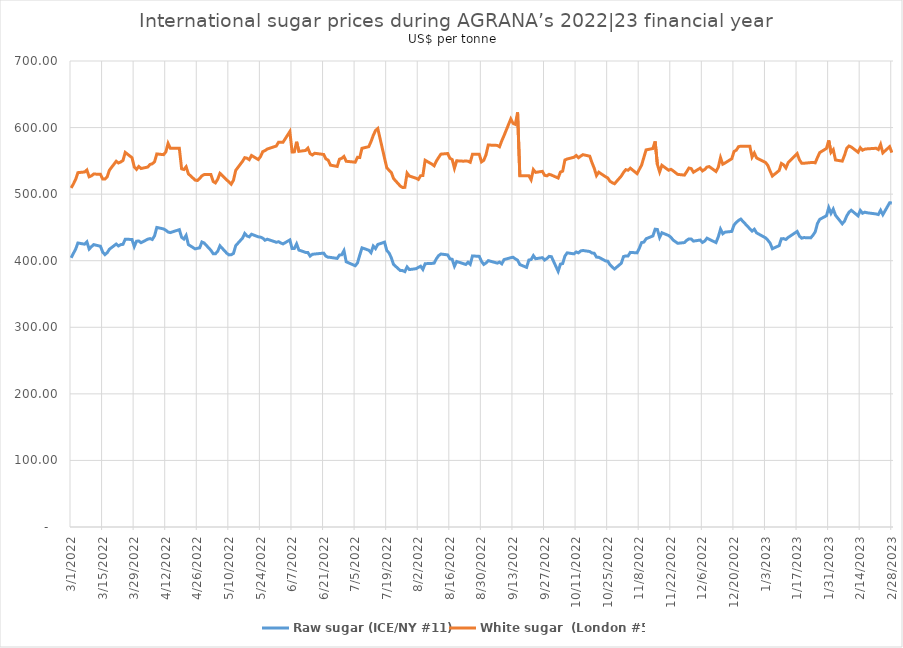
| Category | Raw sugar (ICE/NY #11) | White sugar  (London #5) |
|---|---|---|
| 3/1/22 | 404.328 | 509.3 |
| 3/2/22 | 410.942 | 515.2 |
| 3/3/22 | 417.335 | 522.2 |
| 3/4/22 | 426.595 | 532.3 |
| 3/7/22 | 424.831 | 533.3 |
| 3/8/22 | 428.358 | 536.3 |
| 3/9/22 | 417.556 | 526.1 |
| 3/10/22 | 421.083 | 527.5 |
| 3/11/22 | 424.17 | 530.2 |
| 3/14/22 | 421.745 | 529.8 |
| 3/15/22 | 412.926 | 522.7 |
| 3/16/22 | 409.178 | 522.6 |
| 3/17/22 | 412.044 | 526 |
| 3/18/22 | 417.335 | 536.1 |
| 3/21/22 | 425.052 | 549.4 |
| 3/22/22 | 422.186 | 546.8 |
| 3/23/22 | 424.17 | 548.4 |
| 3/24/22 | 424.611 | 550.6 |
| 3/25/22 | 432.327 | 562.7 |
| 3/28/22 | 431.886 | 554.8 |
| 3/29/22 | 421.304 | 540.8 |
| 3/30/22 | 429.24 | 537.2 |
| 3/31/22 | 429.681 | 541.5 |
| 4/1/22 | 427.036 | 538.5 |
| 4/4/22 | 432.327 | 540.7 |
| 4/5/22 | 433.209 | 544.6 |
| 4/6/22 | 431.886 | 545.6 |
| 4/7/22 | 437.397 | 548.7 |
| 4/8/22 | 449.964 | 560.4 |
| 4/11/22 | 447.759 | 559.3 |
| 4/12/22 | 445.775 | 563.4 |
| 4/13/22 | 443.129 | 576.2 |
| 4/14/22 | 442.248 | 568.8 |
| 4/18/22 | 446.657 | 568.8 |
| 4/19/22 | 435.193 | 538 |
| 4/20/22 | 432.547 | 537 |
| 4/21/22 | 438.059 | 541.1 |
| 4/22/22 | 424.17 | 530.5 |
| 4/25/22 | 417.776 | 521.1 |
| 4/26/22 | 418.658 | 520.5 |
| 4/27/22 | 419.319 | 523.5 |
| 4/28/22 | 428.138 | 527.5 |
| 4/29/22 | 426.595 | 529.4 |
| 5/2/22 | 415.572 | 529.4 |
| 5/3/22 | 410.501 | 519 |
| 5/4/22 | 410.501 | 516.9 |
| 5/5/22 | 414.028 | 522.3 |
| 5/6/22 | 422.406 | 531.3 |
| 5/9/22 | 411.383 | 521.4 |
| 5/10/22 | 408.737 | 518.3 |
| 5/11/22 | 408.958 | 515 |
| 5/12/22 | 410.942 | 520.9 |
| 5/13/22 | 422.626 | 535.7 |
| 5/16/22 | 433.87 | 549.2 |
| 5/17/22 | 440.925 | 554.8 |
| 5/18/22 | 437.177 | 554 |
| 5/19/22 | 435.854 | 551.8 |
| 5/20/22 | 439.822 | 558.1 |
| 5/23/22 | 435.854 | 552 |
| 5/24/22 | 435.413 | 556.5 |
| 5/25/22 | 433.87 | 563.9 |
| 5/26/22 | 430.784 | 565.4 |
| 5/27/22 | 432.327 | 567.8 |
| 5/31/22 | 427.697 | 572.3 |
| 6/1/22 | 428.579 | 578.1 |
| 6/2/22 | 426.595 | 578.1 |
| 6/3/22 | 425.272 | 578.1 |
| 6/6/22 | 431.224 | 594 |
| 6/7/22 | 418.217 | 563.4 |
| 6/8/22 | 418.438 | 563.5 |
| 6/9/22 | 425.272 | 578.7 |
| 6/10/22 | 416.013 | 564.3 |
| 6/13/22 | 412.485 | 565.6 |
| 6/14/22 | 412.265 | 569.1 |
| 6/15/22 | 406.974 | 560.8 |
| 6/16/22 | 409.619 | 558.8 |
| 6/17/22 | 410.06 | 561.4 |
| 6/21/22 | 411.383 | 559.6 |
| 6/22/22 | 406.753 | 553 |
| 6/23/22 | 405.21 | 551 |
| 6/24/22 | 404.989 | 543.6 |
| 6/27/22 | 403.446 | 541.6 |
| 6/28/22 | 408.517 | 552.5 |
| 6/29/22 | 408.958 | 553.8 |
| 6/30/22 | 415.131 | 556.6 |
| 7/1/22 | 398.376 | 549.4 |
| 7/5/22 | 392.423 | 548 |
| 7/6/22 | 396.612 | 555.3 |
| 7/7/22 | 408.296 | 555 |
| 7/8/22 | 419.319 | 568.9 |
| 7/11/22 | 415.792 | 571.3 |
| 7/12/22 | 412.044 | 578.9 |
| 7/13/22 | 421.965 | 588.2 |
| 7/14/22 | 418.217 | 595.6 |
| 7/15/22 | 424.39 | 598.6 |
| 7/18/22 | 427.918 | 554.1 |
| 7/19/22 | 415.351 | 539.6 |
| 7/20/22 | 411.603 | 535.9 |
| 7/21/22 | 404.549 | 532.6 |
| 7/22/22 | 394.407 | 523.4 |
| 7/25/22 | 385.148 | 512.1 |
| 7/26/22 | 385.148 | 510 |
| 7/27/22 | 383.605 | 510.2 |
| 7/28/22 | 390.659 | 531.6 |
| 7/29/22 | 386.691 | 527.2 |
| 8/1/22 | 388.014 | 523.9 |
| 8/2/22 | 389.998 | 522.1 |
| 8/3/22 | 391.762 | 527.7 |
| 8/4/22 | 386.912 | 528 |
| 8/5/22 | 395.51 | 550.9 |
| 8/8/22 | 395.95 | 545.1 |
| 8/9/22 | 396.391 | 542.6 |
| 8/10/22 | 403.005 | 549.7 |
| 8/11/22 | 407.635 | 555.1 |
| 8/12/22 | 410.06 | 560.1 |
| 8/15/22 | 408.737 | 561 |
| 8/16/22 | 402.785 | 553.9 |
| 8/17/22 | 402.123 | 552 |
| 8/18/22 | 391.762 | 538.9 |
| 8/19/22 | 398.816 | 550.1 |
| 8/22/22 | 395.51 | 549.5 |
| 8/23/22 | 394.407 | 549.8 |
| 8/24/22 | 397.714 | 549.5 |
| 8/25/22 | 394.628 | 547.9 |
| 8/26/22 | 407.194 | 559.9 |
| 8/29/22 | 406.533 | 559.9 |
| 8/30/22 | 399.037 | 548.5 |
| 8/31/22 | 394.407 | 550.8 |
| 9/1/22 | 396.612 | 559.1 |
| 9/2/22 | 400.139 | 573.8 |
| 9/6/22 | 396.391 | 573.2 |
| 9/7/22 | 397.935 | 571.2 |
| 9/8/22 | 395.289 | 580.2 |
| 9/9/22 | 401.682 | 588 |
| 9/12/22 | 404.549 | 613 |
| 9/13/22 | 405.21 | 606.3 |
| 9/14/22 | 402.785 | 604.8 |
| 9/15/22 | 400.801 | 622.8 |
| 9/16/22 | 394.187 | 527.8 |
| 9/19/22 | 389.998 | 527.8 |
| 9/20/22 | 401.021 | 527.7 |
| 9/21/22 | 401.682 | 521.6 |
| 9/22/22 | 407.635 | 536.9 |
| 9/23/22 | 403.005 | 532.7 |
| 9/26/22 | 404.549 | 534.2 |
| 9/27/22 | 401.021 | 528.3 |
| 9/28/22 | 403.226 | 527.5 |
| 9/29/22 | 406.533 | 529.8 |
| 9/30/22 | 406.092 | 528.7 |
| 10/3/22 | 384.046 | 524.2 |
| 10/4/22 | 394.848 | 533.1 |
| 10/5/22 | 395.73 | 534.6 |
| 10/6/22 | 406.974 | 551.3 |
| 10/7/22 | 411.824 | 552.8 |
| 10/10/22 | 410.281 | 555.4 |
| 10/11/22 | 413.147 | 558 |
| 10/12/22 | 411.824 | 554.6 |
| 10/13/22 | 414.69 | 557.2 |
| 10/14/22 | 415.351 | 559.3 |
| 10/17/22 | 413.808 | 557 |
| 10/18/22 | 411.603 | 547.3 |
| 10/19/22 | 411.162 | 538.8 |
| 10/20/22 | 405.43 | 527.9 |
| 10/21/22 | 405.21 | 533 |
| 10/24/22 | 399.698 | 526.2 |
| 10/25/22 | 399.257 | 524.3 |
| 10/26/22 | 393.746 | 519.3 |
| 10/27/22 | 390.439 | 517.2 |
| 10/28/22 | 387.573 | 515.6 |
| 10/31/22 | 396.171 | 527.2 |
| 11/1/22 | 406.312 | 532.7 |
| 11/2/22 | 407.194 | 536.8 |
| 11/3/22 | 407.194 | 535.9 |
| 11/4/22 | 412.485 | 539 |
| 11/7/22 | 411.824 | 530.8 |
| 11/8/22 | 418.879 | 537.3 |
| 11/9/22 | 427.256 | 543.5 |
| 11/10/22 | 427.918 | 555.1 |
| 11/11/22 | 432.988 | 566.5 |
| 11/14/22 | 437.177 | 568.5 |
| 11/15/22 | 447.318 | 579.2 |
| 11/16/22 | 446.877 | 544.6 |
| 11/17/22 | 434.972 | 533.4 |
| 11/18/22 | 442.027 | 543.3 |
| 11/21/22 | 437.838 | 535.9 |
| 11/22/22 | 435.193 | 537.3 |
| 11/23/22 | 431.004 | 535 |
| 11/25/22 | 426.154 | 529.7 |
| 11/28/22 | 427.256 | 528.6 |
| 11/29/22 | 430.563 | 533.7 |
| 11/30/22 | 432.768 | 539.2 |
| 12/1/22 | 432.547 | 538.4 |
| 12/2/22 | 429.461 | 532.9 |
| 12/5/22 | 431.004 | 539.1 |
| 12/6/22 | 427.477 | 534.9 |
| 12/7/22 | 429.461 | 537.1 |
| 12/8/22 | 433.87 | 540.6 |
| 12/9/22 | 432.106 | 541.4 |
| 12/12/22 | 427.256 | 534 |
| 12/13/22 | 435.634 | 540.3 |
| 12/14/22 | 447.318 | 554.8 |
| 12/15/22 | 440.484 | 545 |
| 12/16/22 | 442.909 | 546.8 |
| 12/19/22 | 444.011 | 553.2 |
| 12/20/22 | 453.712 | 564.1 |
| 12/21/22 | 457.459 | 566.1 |
| 12/22/22 | 460.546 | 571.3 |
| 12/23/22 | 462.53 | 572.1 |
| 12/27/22 | 447.98 | 572.1 |
| 12/28/22 | 444.452 | 555.7 |
| 12/29/22 | 447.318 | 561.8 |
| 12/30/22 | 441.807 | 554.4 |
| 1/3/23 | 434.311 | 547.5 |
| 1/4/23 | 430.784 | 543.1 |
| 1/5/23 | 426.374 | 534.7 |
| 1/6/23 | 417.997 | 527.2 |
| 1/9/23 | 422.626 | 535.5 |
| 1/10/23 | 432.988 | 546.1 |
| 1/11/23 | 433.209 | 544 |
| 1/12/23 | 431.886 | 539.3 |
| 1/13/23 | 434.972 | 547.3 |
| 1/17/23 | 444.011 | 560.9 |
| 1/18/23 | 436.956 | 551.6 |
| 1/19/23 | 433.87 | 546.5 |
| 1/20/23 | 434.752 | 546.4 |
| 1/23/23 | 434.311 | 547.4 |
| 1/24/23 | 438.279 | 547.7 |
| 1/25/23 | 443.35 | 547 |
| 1/26/23 | 455.916 | 555 |
| 1/27/23 | 462.089 | 562.4 |
| 1/30/23 | 467.601 | 568.7 |
| 1/31/23 | 479.726 | 580.7 |
| 2/1/23 | 471.128 | 562.7 |
| 2/2/23 | 477.522 | 566.8 |
| 2/3/23 | 468.262 | 551.3 |
| 2/6/23 | 455.475 | 549.6 |
| 2/7/23 | 459.444 | 558.4 |
| 2/8/23 | 467.38 | 568.9 |
| 2/9/23 | 472.892 | 572.3 |
| 2/10/23 | 475.758 | 570.8 |
| 2/13/23 | 467.38 | 563 |
| 2/14/23 | 475.537 | 569.7 |
| 2/15/23 | 471.349 | 566 |
| 2/16/23 | 472.892 | 567.6 |
| 2/17/23 | 472.01 | 568 |
| 2/21/23 | 470.246 | 568.9 |
| 2/22/23 | 469.364 | 567 |
| 2/23/23 | 475.758 | 574.7 |
| 2/24/23 | 469.144 | 562 |
| 2/27/23 | 487.001 | 571.3 |
| 2/28/23 | 486.781 | 562.4 |